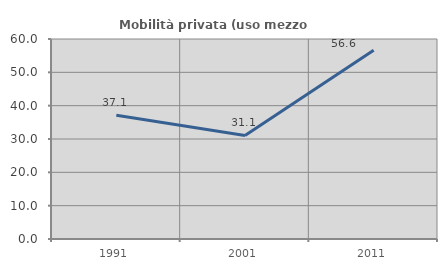
| Category | Mobilità privata (uso mezzo privato) |
|---|---|
| 1991.0 | 37.099 |
| 2001.0 | 31.066 |
| 2011.0 | 56.604 |